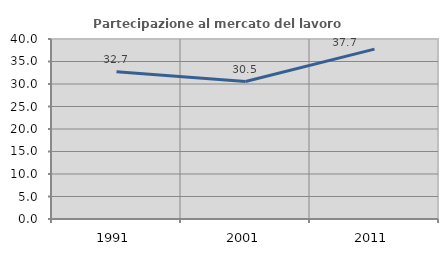
| Category | Partecipazione al mercato del lavoro  femminile |
|---|---|
| 1991.0 | 32.749 |
| 2001.0 | 30.548 |
| 2011.0 | 37.747 |